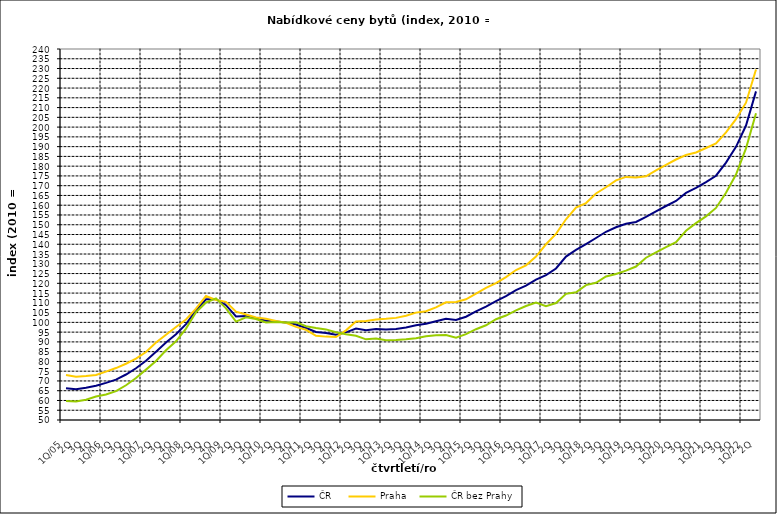
| Category | ČR  | Praha | ČR bez Prahy  |
|---|---|---|---|
| 1Q/05 | 66.3 | 73 | 59.7 |
| 2Q | 65.8 | 72.1 | 59.5 |
| 3Q | 66.5 | 72.5 | 60.4 |
| 4Q | 67.5 | 73.1 | 62 |
| 1Q/06 | 69 | 74.8 | 63.1 |
| 2Q | 70.7 | 76.6 | 64.8 |
| 3Q | 73.3 | 78.8 | 67.8 |
| 4Q | 76.5 | 81.4 | 71.5 |
| 1Q/07 | 80.3 | 84.8 | 75.8 |
| 2Q | 84.9 | 89.7 | 80.2 |
| 3Q | 89.7 | 93.7 | 85.7 |
| 4Q | 93.9 | 97.6 | 90.3 |
| 1Q/08 | 99.1 | 101.5 | 96.8 |
| 2Q | 106.1 | 107 | 105.2 |
| 3Q | 111.8 | 113.5 | 110.2 |
| 4Q | 111.9 | 111.5 | 112.3 |
| 1Q/09 | 108.8 | 110.5 | 107.2 |
| 2Q | 103 | 105.5 | 100.4 |
| 3Q | 103.3 | 104 | 102.6 |
| 4Q | 102.1 | 102.5 | 101.7 |
| 1Q/10 | 100.8 | 101.8 | 99.9 |
| 2Q | 100.4 | 100.7 | 100.2 |
| 3Q | 99.9 | 99.8 | 99.9 |
| 4Q | 98.9 | 97.7 | 100 |
| 1Q/11 | 97.1 | 96.2 | 98 |
| 2Q | 95.1 | 93.1 | 97.1 |
| 3Q | 94.5 | 92.7 | 96.4 |
| 4Q | 93.7 | 92.5 | 94.9 |
| 1Q/12 | 94.9 | 95.9 | 93.9 |
| 2Q | 96.8 | 100.4 | 93.1 |
| 3Q | 96 | 100.7 | 91.3 |
| 4Q | 96.6 | 101.5 | 91.7 |
| 1Q/13 | 96.4 | 101.8 | 90.9 |
| 2Q | 96.6 | 102.3 | 91 |
| 3Q | 97.4 | 103.4 | 91.3 |
| 4Q | 98.5 | 105 | 91.9 |
| 1Q/14 | 99.3 | 105.7 | 92.9 |
| 2Q | 100.6 | 107.7 | 93.4 |
| 3Q | 101.9 | 110.3 | 93.5 |
| 4Q | 101.2 | 110.4 | 92.1 |
| 1Q/15 | 102.9 | 111.8 | 94 |
| 2Q | 105.6 | 114.7 | 96.5 |
| 3Q | 108.1 | 117.7 | 98.5 |
| 4Q | 110.9 | 120.1 | 101.6 |
| 1Q/16 | 113.4 | 123.2 | 103.5 |
| 2Q | 116.5 | 126.8 | 106.1 |
| 3Q | 118.8 | 129.2 | 108.4 |
| 4Q | 121.9 | 133.7 | 110.2 |
| 1Q/17 | 124.2 | 140 | 108.3 |
| 2Q | 127.6 | 145.3 | 109.9 |
| 3Q | 133.7 | 152.8 | 114.6 |
| 4Q | 137.1 | 158.8 | 115.4 |
| 1Q/18 | 140.1 | 161.1 | 119.1 |
| 2Q | 143.2 | 166 | 120.3 |
| 3Q | 146.4 | 169.2 | 123.5 |
| 4Q | 148.7 | 172.7 | 124.8 |
| 1Q/19 | 150.5 | 174.5 | 126.5 |
| 2Q | 151.4 | 174.2 | 128.6 |
| 3Q | 154 | 174.8 | 133.1 |
| 4Q | 156.9 | 177.8 | 135.9 |
| 1Q/20 | 159.6 | 180.7 | 138.5 |
| 2Q | 162.2 | 183.4 | 141.1 |
| 3Q | 166.3 | 185.7 | 146.9 |
| 4Q | 168.9 | 187 | 150.8 |
| 1Q/21 | 171.8 | 189.3 | 154.3 |
| 2Q | 175.1 | 191.7 | 158.6 |
| 3Q | 181.8 | 197.3 | 166.4 |
| 4Q | 189.9 | 204.1 | 175.7 |
| 1Q/22 | 200.8 | 212.5 | 189.1 |
| 2Q | 218.3 | 229.5 | 207.1 |